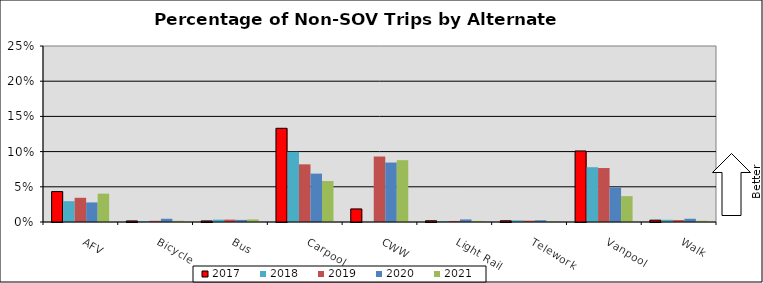
| Category | 2017 | 2018 | 2019 | 2020 | 2021 |
|---|---|---|---|---|---|
| AFV | 0.043 | 0.03 | 0.034 | 0.028 | 0.04 |
| Bicycle | 0.002 | 0.001 | 0.002 | 0.005 | 0.002 |
| Bus | 0.002 | 0.003 | 0.003 | 0.003 | 0.004 |
| Carpool | 0.133 | 0.1 | 0.082 | 0.069 | 0.058 |
| CWW | 0.019 | 0 | 0.093 | 0.084 | 0.088 |
| Light Rail | 0.002 | 0.001 | 0.001 | 0.004 | 0.002 |
| Telework | 0.002 | 0.002 | 0.002 | 0.003 | 0.001 |
| Vanpool | 0.101 | 0.078 | 0.077 | 0.049 | 0.037 |
| Walk | 0.003 | 0.003 | 0.003 | 0.005 | 0.002 |